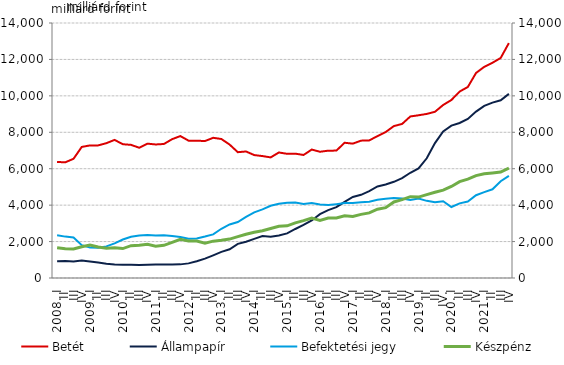
| Category | Betét | Állampapír |
|---|---|---|
| 2008. I | 6369.078 | 923.097 |
| II | 6353.118 | 931.39 |
| III | 6545.865 | 906.504 |
| IV | 7195.751 | 962.149 |
| 2009. I | 7279.039 | 905.838 |
| II | 7280.739 | 850.708 |
| III | 7401.98 | 786.905 |
| IV | 7581.462 | 746.744 |
| 2010. I | 7344.556 | 729.781 |
| II | 7309.284 | 723.671 |
| III | 7151.434 | 720.547 |
| IV | 7376.127 | 729.849 |
| 2011. I | 7331.236 | 741.081 |
| II | 7357.487 | 735.56 |
| III | 7620.95 | 738.711 |
| IV | 7792.493 | 748.232 |
| 2012. I | 7541.756 | 802.887 |
| II | 7538.73 | 915.513 |
| III | 7518.398 | 1061.912 |
| IV | 7697.379 | 1245.713 |
| 2013. I | 7631.341 | 1436.118 |
| II | 7325.034 | 1579.732 |
| III | 6907.43 | 1871.773 |
| IV | 6946.278 | 1990.515 |
| 2014. I | 6748.188 | 2148.923 |
| II | 6694.451 | 2301.95 |
| III | 6621.693 | 2270.877 |
| IV | 6892.237 | 2329.773 |
| 2015. I | 6818.008 | 2449.915 |
| II | 6826.452 | 2691.503 |
| III | 6754.516 | 2910.544 |
| IV | 7051.513 | 3159.8 |
| 2016. I | 6930.932 | 3506.213 |
| II | 6991.037 | 3726.482 |
| III | 6994.031 | 3888.133 |
| IV | 7424.79 | 4178.84 |
| 2017. I | 7377.157 | 4451.344 |
| II | 7541.027 | 4565.608 |
| III | 7554.234 | 4767.429 |
| IV | 7791.066 | 5024.922 |
| 2018. I | 8012.701 | 5131.929 |
| II | 8341.826 | 5281.653 |
| III | 8458.359 | 5484.123 |
| IV | 8868.953 | 5778.729 |
| 2019. I | 8934.014 | 6017.98 |
| II | 9008.278 | 6572.216 |
| III | 9125.526 | 7407.438 |
| IV. | 9499.629 | 8047.086 |
| 2020. I | 9772.197 | 8369.14 |
| II | 10235.749 | 8510.235 |
| III | 10486.847 | 8733.518 |
| IV | 11255.255 | 9135.601 |
| 2021. I | 11593.618 | 9446.905 |
| II | 11817.469 | 9629.955 |
| III | 12080.024 | 9757.916 |
| IV | 12899.115 | 10110.085 |